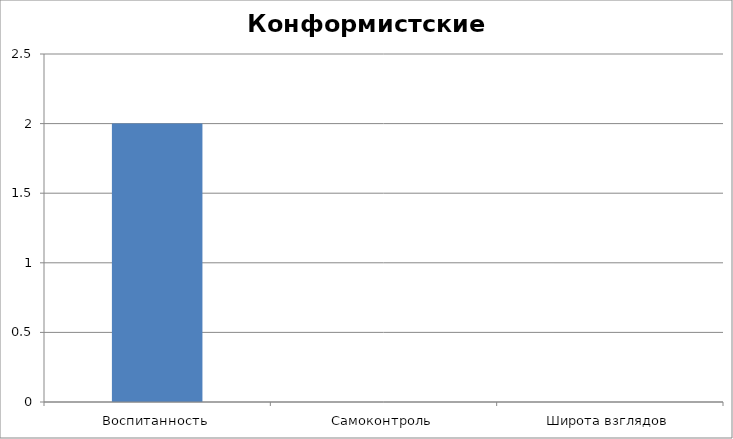
| Category | Конформистские ценности |
|---|---|
| Воспитанность | 2 |
| Самоконтроль | 0 |
| Широта взглядов | 0 |